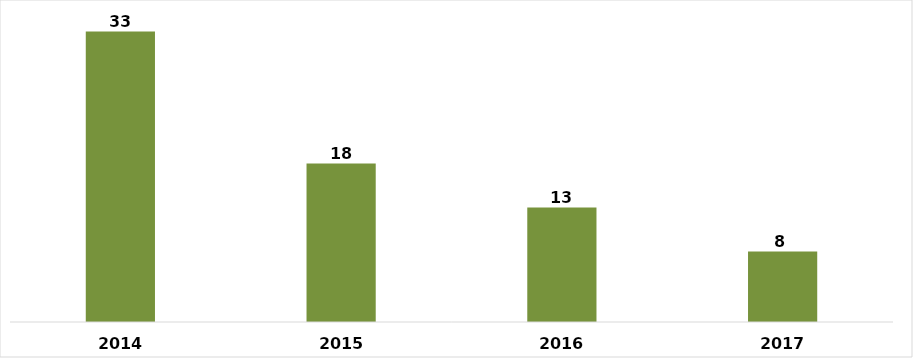
| Category | CANTIDAD |
|---|---|
| 2014.0 | 33 |
| 2015.0 | 18 |
| 2016.0 | 13 |
| 2017.0 | 8 |